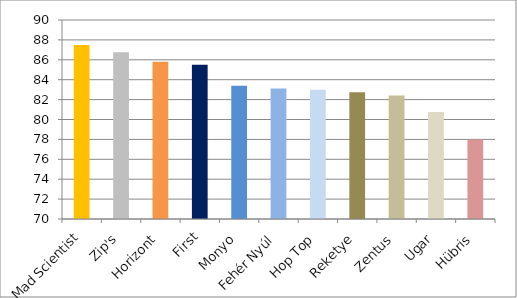
| Category | Series 0 |
|---|---|
| Mad Scientist | 87.5 |
| Zip's | 86.75 |
| Horizont | 85.8 |
| First | 85.5 |
| Monyo | 83.4 |
| Fehér Nyúl | 83.125 |
| Hop Top | 83 |
| Reketye | 82.75 |
| Zentus | 82.4 |
| Ugar | 80.75 |
| Hübris | 78 |